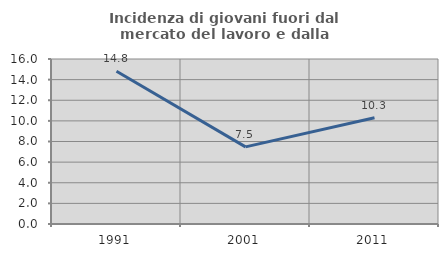
| Category | Incidenza di giovani fuori dal mercato del lavoro e dalla formazione  |
|---|---|
| 1991.0 | 14.815 |
| 2001.0 | 7.477 |
| 2011.0 | 10.309 |